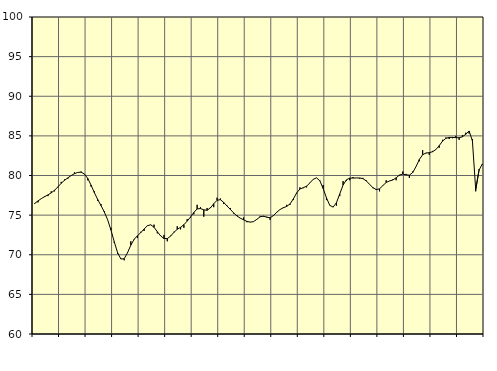
| Category | Piggar | Samtliga sysselsatta (inkl. sysselsatta utomlands) |
|---|---|---|
| nan | 76.4 | 76.48 |
| 87.0 | 76.6 | 76.79 |
| 87.0 | 77.1 | 77.08 |
| 87.0 | 77.4 | 77.33 |
| nan | 77.4 | 77.55 |
| 88.0 | 78 | 77.81 |
| 88.0 | 78 | 78.14 |
| 88.0 | 78.5 | 78.56 |
| nan | 79.2 | 79.02 |
| 89.0 | 79.5 | 79.39 |
| 89.0 | 79.6 | 79.7 |
| 89.0 | 80 | 79.99 |
| nan | 80.4 | 80.23 |
| 90.0 | 80.4 | 80.39 |
| 90.0 | 80.5 | 80.42 |
| 90.0 | 80.2 | 80.19 |
| nan | 79.4 | 79.64 |
| 91.0 | 78.6 | 78.79 |
| 91.0 | 78 | 77.84 |
| 91.0 | 76.8 | 76.98 |
| nan | 76.4 | 76.21 |
| 92.0 | 75.5 | 75.4 |
| 92.0 | 74.4 | 74.42 |
| 92.0 | 73.4 | 73.13 |
| nan | 71.5 | 71.64 |
| 93.0 | 70.1 | 70.27 |
| 93.0 | 69.5 | 69.46 |
| 93.0 | 69.3 | 69.5 |
| nan | 70.3 | 70.25 |
| 94.0 | 71.7 | 71.21 |
| 94.0 | 71.9 | 71.95 |
| 94.0 | 72.1 | 72.4 |
| nan | 72.9 | 72.79 |
| 95.0 | 73 | 73.25 |
| 95.0 | 73.7 | 73.66 |
| 95.0 | 73.8 | 73.78 |
| nan | 73.8 | 73.47 |
| 96.0 | 72.7 | 72.9 |
| 96.0 | 72.4 | 72.37 |
| 96.0 | 72.5 | 72.05 |
| nan | 71.7 | 72.04 |
| 97.0 | 72.4 | 72.35 |
| 97.0 | 72.9 | 72.83 |
| 97.0 | 73.6 | 73.21 |
| nan | 73.2 | 73.46 |
| 98.0 | 73.4 | 73.79 |
| 98.0 | 74.5 | 74.25 |
| 98.0 | 74.7 | 74.76 |
| nan | 75.1 | 75.34 |
| 99.0 | 76.3 | 75.78 |
| 99.0 | 76 | 75.83 |
| 99.0 | 74.8 | 75.67 |
| nan | 75.9 | 75.61 |
| 0.0 | 76 | 75.91 |
| 0.0 | 76 | 76.43 |
| 0.0 | 77.2 | 76.87 |
| nan | 77.1 | 76.95 |
| 1.0 | 76.4 | 76.61 |
| 1.0 | 76.2 | 76.15 |
| 1.0 | 75.9 | 75.73 |
| nan | 75.2 | 75.28 |
| 2.0 | 75 | 74.89 |
| 2.0 | 74.6 | 74.62 |
| 2.0 | 74.7 | 74.41 |
| nan | 74.1 | 74.21 |
| 3.0 | 74.1 | 74.12 |
| 3.0 | 74.2 | 74.18 |
| 3.0 | 74.5 | 74.47 |
| nan | 74.9 | 74.79 |
| 4.0 | 74.8 | 74.87 |
| 4.0 | 74.8 | 74.73 |
| 4.0 | 74.4 | 74.67 |
| nan | 75 | 74.94 |
| 5.0 | 75.4 | 75.36 |
| 5.0 | 75.7 | 75.71 |
| 5.0 | 76 | 75.93 |
| nan | 76.3 | 76.1 |
| 6.0 | 76.3 | 76.41 |
| 6.0 | 76.9 | 77.04 |
| 6.0 | 77.7 | 77.8 |
| nan | 78.5 | 78.3 |
| 7.0 | 78.4 | 78.46 |
| 7.0 | 78.5 | 78.65 |
| 7.0 | 79.1 | 79.07 |
| nan | 79.5 | 79.52 |
| 8.0 | 79.7 | 79.71 |
| 8.0 | 79.4 | 79.33 |
| 8.0 | 78.8 | 78.36 |
| nan | 76.9 | 77.17 |
| 9.0 | 76.2 | 76.23 |
| 9.0 | 76 | 76.01 |
| 9.0 | 76.2 | 76.56 |
| nan | 77.4 | 77.68 |
| 10.0 | 79.3 | 78.79 |
| 10.0 | 79.3 | 79.45 |
| 10.0 | 79.4 | 79.67 |
| nan | 79.8 | 79.68 |
| 11.0 | 79.7 | 79.69 |
| 11.0 | 79.6 | 79.69 |
| 11.0 | 79.7 | 79.6 |
| nan | 79.4 | 79.32 |
| 12.0 | 78.9 | 78.88 |
| 12.0 | 78.4 | 78.47 |
| 12.0 | 78.3 | 78.22 |
| nan | 78 | 78.32 |
| 13.0 | 78.7 | 78.73 |
| 13.0 | 79.4 | 79.12 |
| 13.0 | 79.3 | 79.31 |
| nan | 79.5 | 79.43 |
| 14.0 | 79.4 | 79.71 |
| 14.0 | 80 | 80.06 |
| 14.0 | 80.5 | 80.18 |
| nan | 80.2 | 80.09 |
| 15.0 | 79.7 | 80.04 |
| 15.0 | 80.5 | 80.37 |
| 15.0 | 81.1 | 81.12 |
| nan | 81.8 | 82.02 |
| 16.0 | 83.2 | 82.62 |
| 16.0 | 82.8 | 82.84 |
| 16.0 | 82.6 | 82.88 |
| nan | 83.1 | 83 |
| 17.0 | 83.3 | 83.28 |
| 17.0 | 83.5 | 83.77 |
| 17.0 | 84.5 | 84.34 |
| nan | 84.8 | 84.69 |
| 18.0 | 84.6 | 84.8 |
| 18.0 | 84.7 | 84.81 |
| 18.0 | 85 | 84.78 |
| nan | 84.5 | 84.76 |
| 19.0 | 85.1 | 84.89 |
| 19.0 | 85.4 | 85.2 |
| 19.0 | 85.3 | 85.62 |
| nan | 84.6 | 84.39 |
| 20.0 | 78 | 78.22 |
| 20.0 | 80.8 | 80.67 |
| 20.0 | 81.4 | 81.46 |